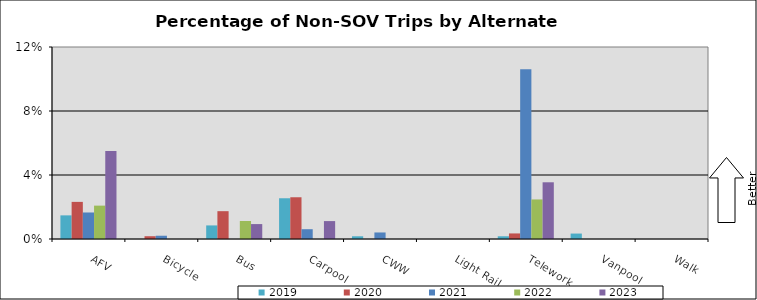
| Category | 2019 | 2020 | 2021 | 2022 | 2023 |
|---|---|---|---|---|---|
| AFV | 0.015 | 0.023 | 0.017 | 0.021 | 0.055 |
| Bicycle | 0 | 0.002 | 0.002 | 0 | 0 |
| Bus | 0.008 | 0.017 | 0 | 0.011 | 0.009 |
| Carpool | 0.025 | 0.026 | 0.006 | 0 | 0.011 |
| CWW | 0.002 | 0 | 0.004 | 0 | 0 |
| Light Rail | 0 | 0 | 0 | 0 | 0 |
| Telework | 0.002 | 0.003 | 0.106 | 0.025 | 0.035 |
| Vanpool | 0.003 | 0 | 0 | 0 | 0 |
| Walk | 0 | 0 | 0 | 0 | 0 |